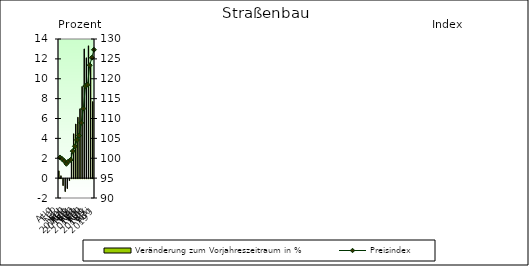
| Category | Veränderung zum Vorjahreszeitraum in % |
|---|---|
| 0 | 0.731 |
| 1 | 0.24 |
| 2 | -0.7 |
| 3 | -1.301 |
| 4 | -0.998 |
| 5 | -0.2 |
| 6 | 2.518 |
| 7 | 4.462 |
| 8 | 5.444 |
| 9 | 6.124 |
| 10 | 6.974 |
| 11 | 9.223 |
| 12 | 13.002 |
| 13 | 12.11 |
| 14 | 13.315 |
| 15 | 11.378 |
| 16 | 7.699 |